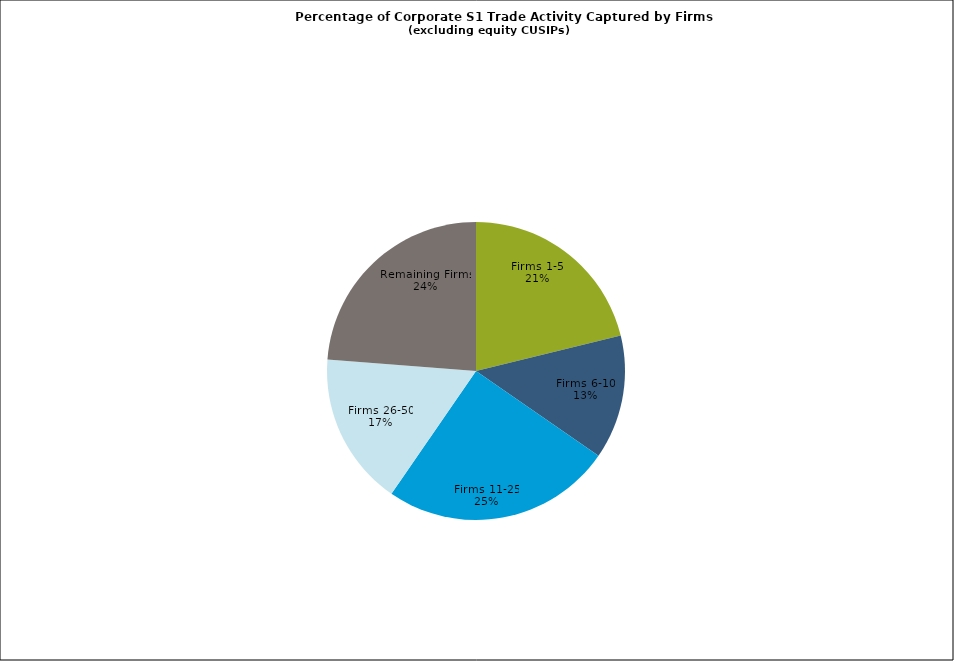
| Category | Series 0 |
|---|---|
| Firms 1-5 | 0.212 |
| Firms 6-10 | 0.135 |
| Firms 11-25 | 0.25 |
| Firms 26-50 | 0.166 |
| Remaining Firms | 0.238 |